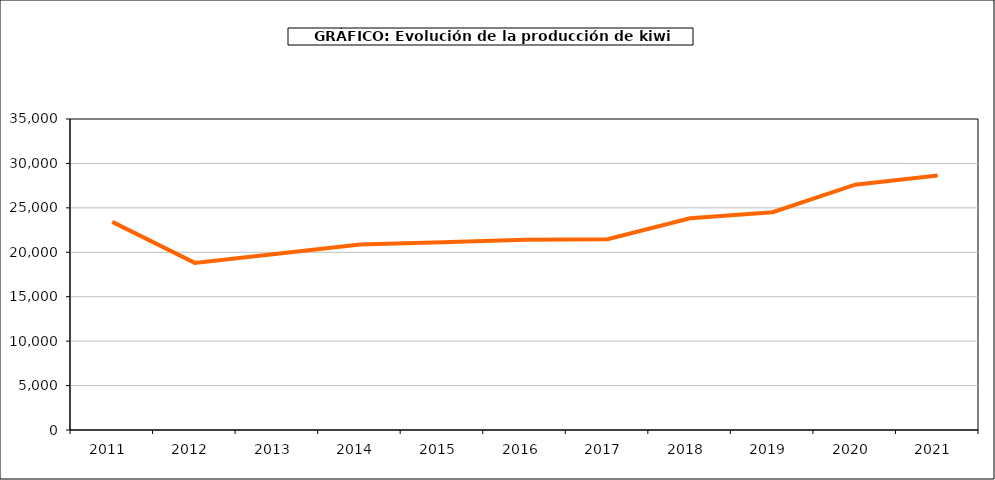
| Category | producción kiwi |
|---|---|
| 2011.0 | 23425 |
| 2012.0 | 18804 |
| 2013.0 | 19834 |
| 2014.0 | 20884 |
| 2015.0 | 21135 |
| 2016.0 | 21409 |
| 2017.0 | 21463 |
| 2018.0 | 23833 |
| 2019.0 | 24508 |
| 2020.0 | 27613 |
| 2021.0 | 28654 |